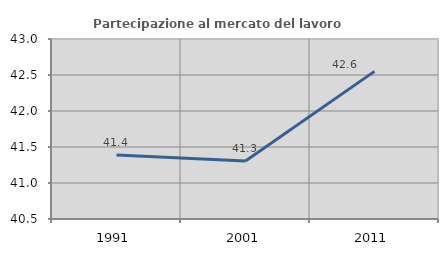
| Category | Partecipazione al mercato del lavoro  femminile |
|---|---|
| 1991.0 | 41.388 |
| 2001.0 | 41.304 |
| 2011.0 | 42.55 |